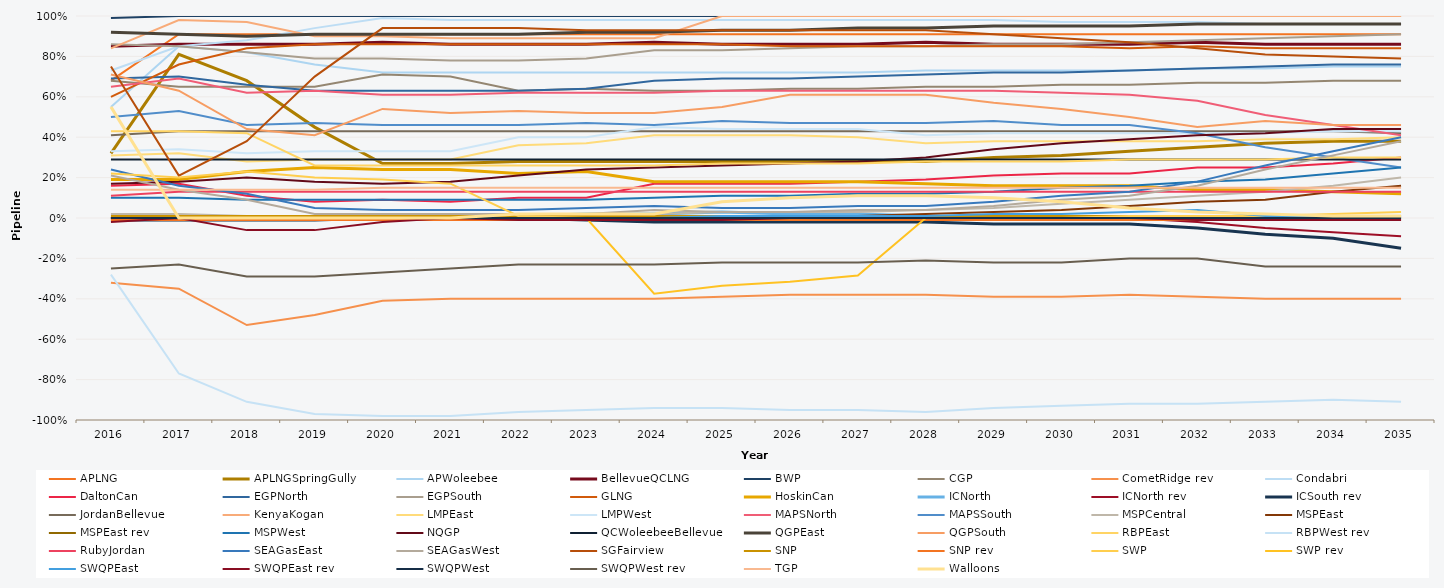
| Category | APLNG | APLNGSpringGully | APWoleebee | BellevueQCLNG | BWP | CGP | CometRidge rev | Condabri | DaltonCan | EGPNorth | EGPSouth | GLNG | HoskinCan | ICNorth | ICNorth rev | ICSouth rev | JordanBellevue | KenyaKogan | LMPEast | LMPWest | MAPSNorth | MAPSSouth | MSPCentral | MSPEast | MSPEast rev | MSPWest | NQGP | QCWoleebeeBellevue | QGPEast | QGPSouth | RBPEast | RBPWest rev | RubyJordan | SEAGasEast | SEAGasWest | SGFairview | SNP | SNP rev | SWP | SWP rev | SWQPEast | SWQPEast rev | SWQPWest | SWQPWest rev | TGP | Walloons |
|---|---|---|---|---|---|---|---|---|---|---|---|---|---|---|---|---|---|---|---|---|---|---|---|---|---|---|---|---|---|---|---|---|---|---|---|---|---|---|---|---|---|---|---|---|---|---|
| 2016.0 | 0.68 | 0.32 | 0.55 | 0.85 | 0.99 | 0.68 | -0.32 | 0.73 | 0.16 | 0.69 | 0.86 | 0.6 | 0.19 | 0 | 0 | -0.01 | 0.41 | 0.84 | 0.31 | 0.33 | 0.65 | 0.5 | 0.02 | 0 | 0 | 0.1 | 0.17 | 0.29 | 0.92 | 0.71 | 0.43 | -0.28 | 0.11 | 0.24 | 0.21 | 0.75 | 0.01 | -0.01 | 0.22 | 0 | 0 | -0.02 | 0 | -0.25 | 0.14 | 0.55 |
| 2017.0 | 0.91 | 0.81 | 0.85 | 0.86 | 1 | 0.65 | -0.35 | 0.85 | 0.17 | 0.7 | 0.85 | 0.76 | 0.19 | 0 | 0 | -0.01 | 0.43 | 0.98 | 0.32 | 0.34 | 0.69 | 0.53 | 0.02 | 0 | 0 | 0.1 | 0.18 | 0.29 | 0.91 | 0.63 | 0.43 | -0.77 | 0.13 | 0.16 | 0.14 | 0.21 | 0.01 | -0.01 | 0.2 | 0 | 0 | 0 | 0 | -0.23 | 0.14 | 0 |
| 2018.0 | 0.91 | 0.68 | 0.82 | 0.86 | 1 | 0.65 | -0.53 | 0.88 | 0.11 | 0.66 | 0.82 | 0.84 | 0.23 | 0 | 0 | -0.01 | 0.43 | 0.97 | 0.28 | 0.32 | 0.62 | 0.46 | 0.01 | 0 | 0 | 0.09 | 0.2 | 0.29 | 0.9 | 0.44 | 0.42 | -0.91 | 0.13 | 0.12 | 0.09 | 0.38 | 0.01 | -0.01 | 0.23 | 0 | 0 | -0.06 | 0 | -0.29 | 0.14 | 0 |
| 2019.0 | 0.91 | 0.45 | 0.76 | 0.86 | 1 | 0.65 | -0.48 | 0.94 | 0.08 | 0.63 | 0.79 | 0.86 | 0.25 | 0 | 0 | -0.01 | 0.43 | 0.9 | 0.29 | 0.33 | 0.63 | 0.47 | 0.01 | 0 | 0 | 0.09 | 0.18 | 0.29 | 0.91 | 0.41 | 0.26 | -0.97 | 0.13 | 0.05 | 0.02 | 0.7 | 0.01 | -0.01 | 0.2 | 0 | 0 | -0.06 | 0 | -0.29 | 0.14 | 0 |
| 2020.0 | 0.91 | 0.27 | 0.72 | 0.87 | 1 | 0.71 | -0.41 | 0.99 | 0.09 | 0.63 | 0.79 | 0.86 | 0.24 | 0 | 0 | 0 | 0.43 | 0.9 | 0.29 | 0.33 | 0.61 | 0.46 | 0.01 | 0 | 0 | 0.09 | 0.17 | 0.29 | 0.91 | 0.54 | 0.26 | -0.98 | 0.13 | 0.04 | 0.02 | 0.94 | 0.01 | -0.01 | 0.19 | 0 | 0 | -0.02 | 0 | -0.27 | 0.15 | 0 |
| 2021.0 | 0.91 | 0.27 | 0.72 | 0.86 | 1 | 0.7 | -0.4 | 0.98 | 0.08 | 0.63 | 0.78 | 0.86 | 0.24 | 0 | 0 | 0 | 0.43 | 0.89 | 0.29 | 0.33 | 0.61 | 0.46 | 0.01 | 0 | 0 | 0.09 | 0.18 | 0.29 | 0.91 | 0.52 | 0.26 | -0.98 | 0.13 | 0.04 | 0.02 | 0.94 | 0.01 | -0.01 | 0.17 | 0 | 0 | 0 | 0 | -0.25 | 0.15 | 0 |
| 2022.0 | 0.91 | 0.28 | 0.72 | 0.86 | 1 | 0.63 | -0.4 | 0.98 | 0.1 | 0.63 | 0.78 | 0.86 | 0.22 | 0.01 | 0 | 0 | 0.43 | 0.89 | 0.36 | 0.4 | 0.62 | 0.46 | 0.01 | 0 | 0 | 0.09 | 0.21 | 0.29 | 0.91 | 0.53 | 0.26 | -0.96 | 0.13 | 0.04 | 0.02 | 0.94 | 0.01 | -0.01 | 0.01 | 0 | 0 | -0.01 | 0 | -0.23 | 0.15 | 0.02 |
| 2023.0 | 0.91 | 0.28 | 0.72 | 0.86 | 1 | 0.64 | -0.4 | 0.98 | 0.1 | 0.64 | 0.79 | 0.86 | 0.23 | 0.02 | 0 | -0.01 | 0.43 | 0.89 | 0.37 | 0.4 | 0.62 | 0.47 | 0.01 | 0 | 0 | 0.09 | 0.24 | 0.29 | 0.92 | 0.52 | 0.26 | -0.95 | 0.13 | 0.05 | 0.02 | 0.93 | 0.01 | -0.01 | 0 | 0 | 0 | -0.01 | 0 | -0.23 | 0.15 | 0.02 |
| 2024.0 | 0.91 | 0.28 | 0.72 | 0.87 | 1 | 0.63 | -0.4 | 0.98 | 0.17 | 0.68 | 0.83 | 0.86 | 0.18 | 0.02 | 0 | -0.02 | 0.43 | 0.89 | 0.41 | 0.45 | 0.62 | 0.46 | 0.02 | 0 | 0 | 0.1 | 0.25 | 0.29 | 0.92 | 0.52 | 0.26 | -0.94 | 0.13 | 0.06 | 0.04 | 0.93 | 0.01 | -0.01 | 0 | -0.375 | 0 | -0.01 | 0 | -0.23 | 0.15 | 0.02 |
| 2025.0 | 0.91 | 0.28 | 0.72 | 0.86 | 1 | 0.63 | -0.39 | 0.98 | 0.17 | 0.69 | 0.83 | 0.86 | 0.18 | 0.03 | 0 | -0.02 | 0.43 | 1 | 0.41 | 0.44 | 0.63 | 0.48 | 0.03 | 0.01 | 0 | 0.11 | 0.26 | 0.29 | 0.93 | 0.55 | 0.27 | -0.94 | 0.13 | 0.05 | 0.03 | 0.93 | 0.01 | -0.01 | 0 | -0.335 | 0.01 | -0.01 | 0 | -0.22 | 0.15 | 0.08 |
| 2026.0 | 0.91 | 0.28 | 0.72 | 0.86 | 1 | 0.64 | -0.38 | 0.98 | 0.17 | 0.69 | 0.84 | 0.85 | 0.18 | 0.02 | 0 | -0.02 | 0.43 | 1 | 0.41 | 0.44 | 0.63 | 0.47 | 0.03 | 0.01 | 0 | 0.11 | 0.27 | 0.29 | 0.93 | 0.61 | 0.27 | -0.95 | 0.13 | 0.05 | 0.03 | 0.93 | 0.01 | -0.01 | 0 | -0.315 | 0.01 | 0 | 0 | -0.22 | 0.15 | 0.1 |
| 2027.0 | 0.91 | 0.28 | 0.72 | 0.86 | 1 | 0.64 | -0.38 | 0.98 | 0.18 | 0.7 | 0.85 | 0.85 | 0.18 | 0.02 | 0 | -0.02 | 0.43 | 1 | 0.4 | 0.44 | 0.63 | 0.47 | 0.03 | 0.01 | 0 | 0.12 | 0.28 | 0.29 | 0.94 | 0.61 | 0.27 | -0.95 | 0.13 | 0.06 | 0.04 | 0.93 | 0.01 | -0.01 | 0 | -0.285 | 0.01 | 0 | 0 | -0.22 | 0.15 | 0.11 |
| 2028.0 | 0.91 | 0.28 | 0.73 | 0.87 | 1 | 0.65 | -0.38 | 0.98 | 0.19 | 0.71 | 0.85 | 0.85 | 0.17 | 0.01 | 0 | -0.02 | 0.43 | 1 | 0.37 | 0.41 | 0.63 | 0.47 | 0.04 | 0.02 | 0 | 0.12 | 0.3 | 0.29 | 0.94 | 0.61 | 0.28 | -0.96 | 0.13 | 0.06 | 0.04 | 0.93 | 0.01 | -0.01 | 0 | 0 | 0.01 | 0 | 0 | -0.21 | 0.15 | 0.11 |
| 2029.0 | 0.91 | 0.3 | 0.73 | 0.86 | 1 | 0.65 | -0.39 | 0.98 | 0.21 | 0.72 | 0.86 | 0.85 | 0.16 | 0 | 0 | -0.03 | 0.43 | 1 | 0.38 | 0.42 | 0.63 | 0.48 | 0.05 | 0.03 | 0 | 0.13 | 0.34 | 0.29 | 0.95 | 0.57 | 0.28 | -0.94 | 0.13 | 0.08 | 0.06 | 0.91 | 0.01 | -0.01 | 0 | 0 | 0.02 | 0 | 0 | -0.22 | 0.15 | 0.1 |
| 2030.0 | 0.91 | 0.31 | 0.73 | 0.86 | 1 | 0.66 | -0.39 | 0.97 | 0.22 | 0.72 | 0.86 | 0.85 | 0.16 | 0 | 0 | -0.03 | 0.43 | 1 | 0.38 | 0.42 | 0.62 | 0.46 | 0.07 | 0.04 | 0 | 0.15 | 0.37 | 0.29 | 0.95 | 0.54 | 0.28 | -0.93 | 0.13 | 0.11 | 0.09 | 0.89 | 0.01 | -0.01 | 0 | 0 | 0.02 | 0 | 0 | -0.22 | 0.15 | 0.08 |
| 2031.0 | 0.91 | 0.33 | 0.73 | 0.86 | 1 | 0.66 | -0.38 | 0.97 | 0.22 | 0.73 | 0.87 | 0.84 | 0.16 | 0 | 0 | -0.03 | 0.43 | 1 | 0.38 | 0.42 | 0.61 | 0.46 | 0.09 | 0.06 | 0 | 0.16 | 0.39 | 0.29 | 0.95 | 0.5 | 0.29 | -0.92 | 0.13 | 0.13 | 0.11 | 0.87 | 0.01 | -0.01 | 0.01 | 0 | 0.03 | 0 | 0 | -0.2 | 0.15 | 0.05 |
| 2032.0 | 0.91 | 0.35 | 0.74 | 0.87 | 1 | 0.67 | -0.39 | 0.97 | 0.25 | 0.74 | 0.88 | 0.85 | 0.14 | 0 | -0.02 | -0.05 | 0.43 | 1 | 0.38 | 0.42 | 0.58 | 0.42 | 0.11 | 0.08 | 0 | 0.18 | 0.41 | 0.29 | 0.96 | 0.45 | 0.29 | -0.92 | 0.13 | 0.18 | 0.16 | 0.84 | 0.01 | -0.01 | 0.01 | 0 | 0.04 | -0.01 | 0 | -0.2 | 0.15 | 0.03 |
| 2033.0 | 0.91 | 0.37 | 0.74 | 0.86 | 1 | 0.67 | -0.4 | 0.96 | 0.25 | 0.75 | 0.89 | 0.84 | 0.14 | 0 | -0.05 | -0.08 | 0.43 | 1 | 0.39 | 0.42 | 0.51 | 0.35 | 0.13 | 0.09 | 0 | 0.19 | 0.42 | 0.29 | 0.96 | 0.48 | 0.29 | -0.91 | 0.13 | 0.26 | 0.24 | 0.81 | 0.01 | -0.01 | 0.01 | 0 | 0.01 | -0.01 | 0 | -0.24 | 0.15 | 0.02 |
| 2034.0 | 0.91 | 0.38 | 0.75 | 0.86 | 1 | 0.68 | -0.4 | 0.96 | 0.27 | 0.76 | 0.9 | 0.84 | 0.13 | 0 | -0.07 | -0.1 | 0.43 | 1 | 0.39 | 0.43 | 0.46 | 0.3 | 0.16 | 0.13 | 0 | 0.22 | 0.44 | 0.29 | 0.96 | 0.46 | 0.3 | -0.9 | 0.13 | 0.33 | 0.31 | 0.8 | 0.01 | -0.01 | 0.02 | 0 | 0.01 | -0.01 | 0 | -0.24 | 0.15 | 0.01 |
| 2035.0 | 0.91 | 0.38 | 0.75 | 0.86 | 1 | 0.68 | -0.4 | 0.96 | 0.3 | 0.76 | 0.91 | 0.84 | 0.12 | 0 | -0.09 | -0.15 | 0.42 | 1 | 0.4 | 0.43 | 0.41 | 0.25 | 0.2 | 0.16 | 0 | 0.25 | 0.44 | 0.29 | 0.96 | 0.46 | 0.3 | -0.91 | 0.13 | 0.4 | 0.38 | 0.79 | 0.01 | -0.01 | 0.03 | 0 | 0.01 | -0.01 | 0 | -0.24 | 0.15 | 0.01 |